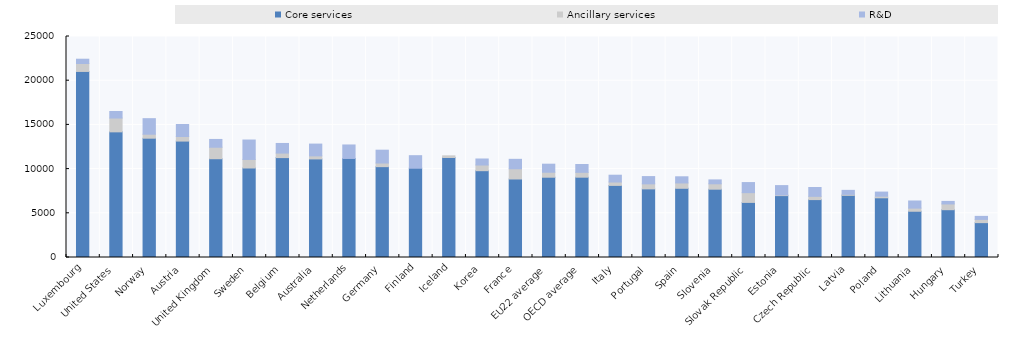
| Category | Core services | Ancillary services | R&D |
|---|---|---|---|
| Luxembourg | 21047.718 | 895.561 | 487.096 |
| United States | 14213.398 | 1562.741 | 742.043 |
| Norway | 13497.007 | 449.802 | 1758.604 |
| Austria | 13169.255 | 518.269 | 1355.375 |
| United Kingdom | 11172.8 | 1300.288 | 881.583 |
| Sweden | 10123.62 | 969.649 | 2195.712 |
| Belgium | 11299.356 | 512.845 | 1087.836 |
| Australia | 11150.524 | 346.593 | 1332.375 |
| Netherlands | 11203.875 | 0 | 1526.018 |
| Germany | 10276.429 | 412.178 | 1450.074 |
| Finland | 10097.593 | 0 | 1420.154 |
| Iceland | 11310.092 | 189.206 | 0 |
| Korea | 9820.077 | 643.966 | 679.26 |
| France | 8880.509 | 1159.987 | 1065.09 |
| EU22 average | 9081.78 | 562.461 | 910.832 |
| OECD average | 9086.118 | 547.809 | 885.856 |
| Italy | 8155.544 | 383.775 | 769.022 |
| Portugal | 7761.935 | 568.983 | 822.175 |
| Spain | 7828.45 | 603.128 | 698.076 |
| Slovenia | 7726.73 | 610.954 | 440.308 |
| Slovak Republic | 6232.769 | 1101.363 | 1142.479 |
| Estonia | 7001.759 | 73.991 | 1057.395 |
| Czech Republic | 6549.8 | 368.141 | 1000.597 |
| Latvia | 7031.866 | 114.43 | 448.821 |
| Poland | 6752.437 | 182.847 | 464.836 |
| Lithuania | 5231.502 | 353.988 | 807.41 |
| Hungary | 5407.329 | 651.011 | 287.881 |
| Turkey | 3944.486 | 367.084 | 340.066 |